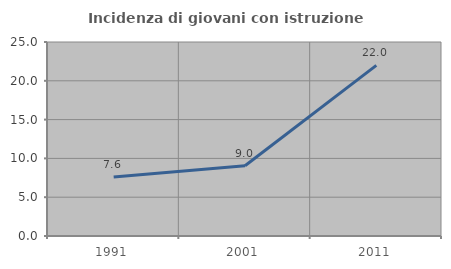
| Category | Incidenza di giovani con istruzione universitaria |
|---|---|
| 1991.0 | 7.595 |
| 2001.0 | 9.048 |
| 2011.0 | 21.992 |